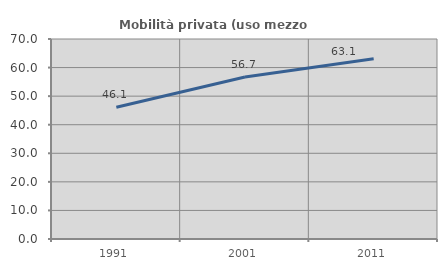
| Category | Mobilità privata (uso mezzo privato) |
|---|---|
| 1991.0 | 46.12 |
| 2001.0 | 56.727 |
| 2011.0 | 63.103 |